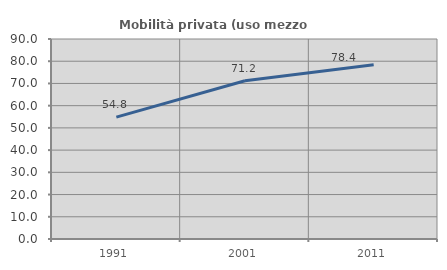
| Category | Mobilità privata (uso mezzo privato) |
|---|---|
| 1991.0 | 54.821 |
| 2001.0 | 71.183 |
| 2011.0 | 78.362 |